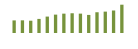
| Category | Saldo [ (1)-(2) ] |
|---|---|
| 0 | 203117.024 |
| 1 | 204244.864 |
| 2 | 198400.412 |
| 3 | 227324.117 |
| 4 | 264760.339 |
| 5 | 296419.004 |
| 6 | 312165.442 |
| 7 | 318321.614 |
| 8 | 312463.312 |
| 9 | 291587.274 |
| 10 | 334649.348 |
| 11 | 344816.778 |
| 12 | 363008.511 |
| 13 | 456483.438 |